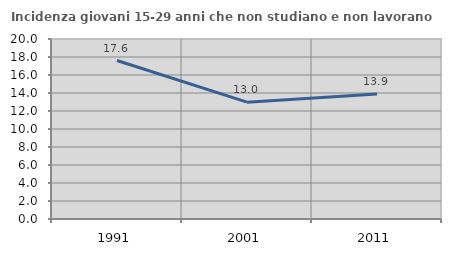
| Category | Incidenza giovani 15-29 anni che non studiano e non lavorano  |
|---|---|
| 1991.0 | 17.61 |
| 2001.0 | 12.983 |
| 2011.0 | 13.895 |